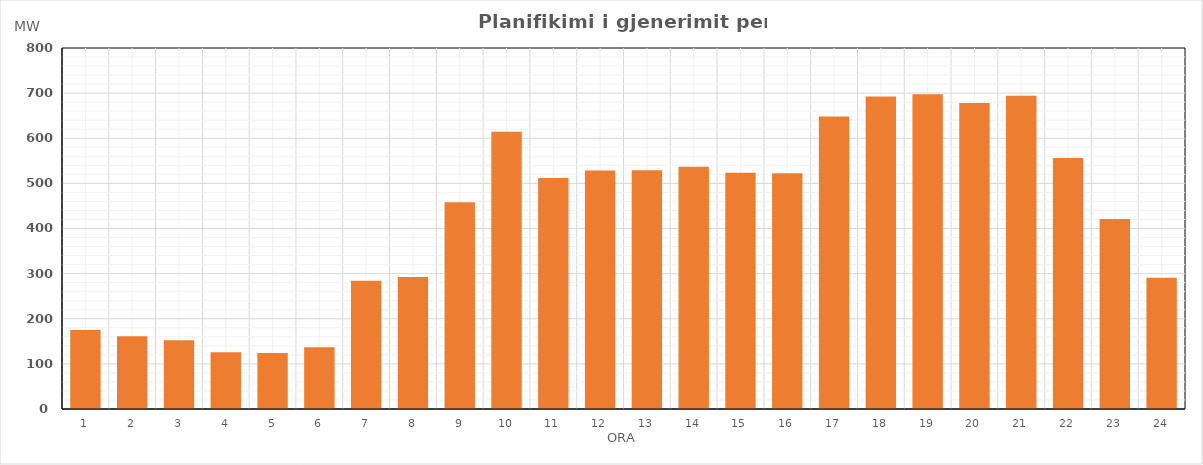
| Category | Max (MW) |
|---|---|
| 0 | 175.324 |
| 1 | 160.957 |
| 2 | 152.569 |
| 3 | 125.784 |
| 4 | 124.199 |
| 5 | 136.575 |
| 6 | 284.39 |
| 7 | 292.435 |
| 8 | 458.202 |
| 9 | 614.642 |
| 10 | 511.87 |
| 11 | 528.322 |
| 12 | 529.251 |
| 13 | 536.683 |
| 14 | 523.386 |
| 15 | 522.268 |
| 16 | 647.998 |
| 17 | 692.707 |
| 18 | 697.355 |
| 19 | 678.044 |
| 20 | 694.23 |
| 21 | 556.129 |
| 22 | 421.033 |
| 23 | 290.934 |